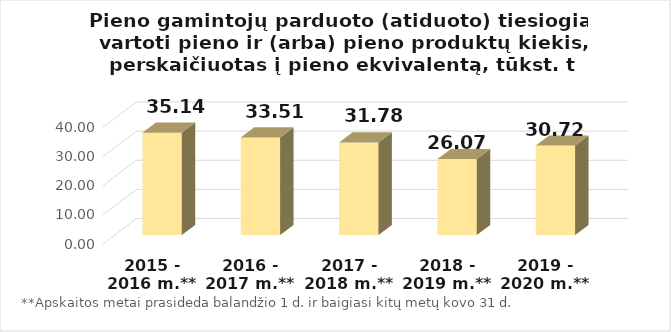
| Category | Pieno gamintojų parduoto (atiduoto) tiesiogiai vartoti pieno ir (arba) pieno produktų kiekis, perskaičiuotas į pieno ekvivalentą (tūkst. t) |
|---|---|
| 2015 - 2016 m.** | 35.143 |
| 2016 - 2017 m.** | 33.51 |
| 2017 - 2018 m.** | 31.783 |
| 2018 - 2019 m.** | 26.075 |
| 2019 - 2020 m.** | 30.717 |